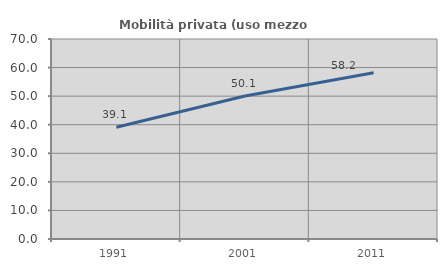
| Category | Mobilità privata (uso mezzo privato) |
|---|---|
| 1991.0 | 39.13 |
| 2001.0 | 50.069 |
| 2011.0 | 58.209 |